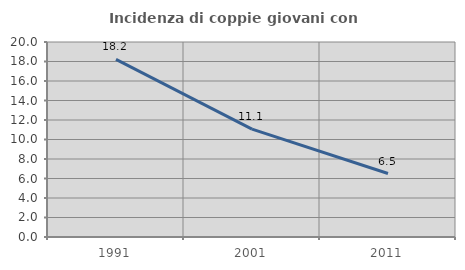
| Category | Incidenza di coppie giovani con figli |
|---|---|
| 1991.0 | 18.218 |
| 2001.0 | 11.06 |
| 2011.0 | 6.508 |